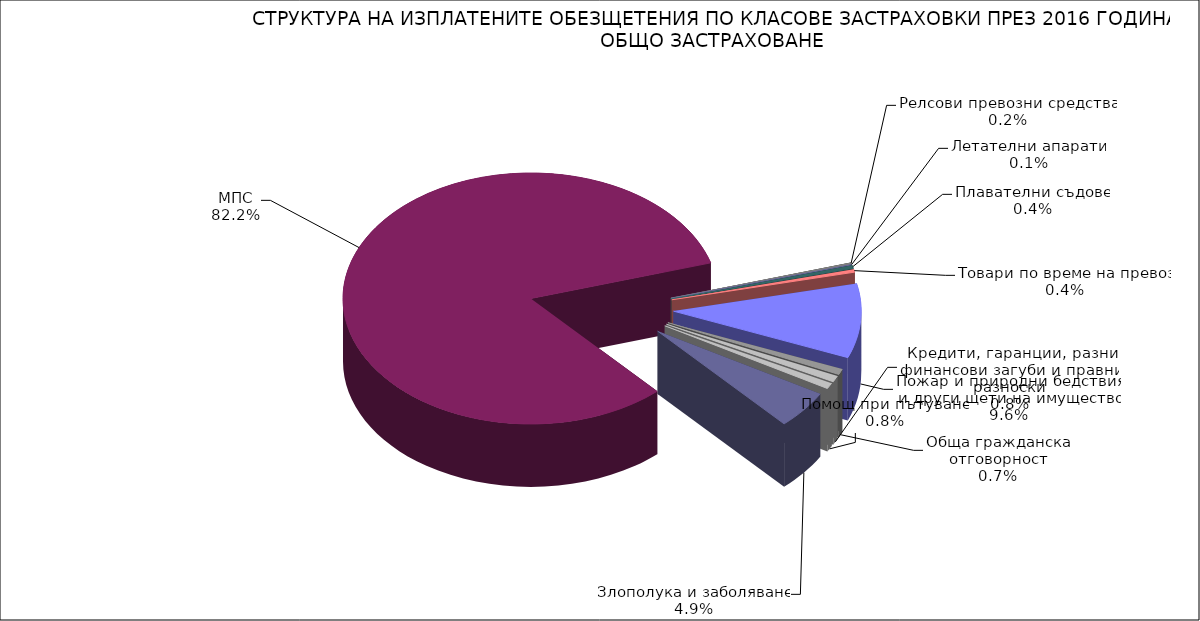
| Category | Series 0 |
|---|---|
| Злополука и заболяване | 0.049 |
| МПС | 0.822 |
| Релсови превозни средства | 0.002 |
| Летателни апарати | 0.001 |
| Плавателни съдове | 0.004 |
| Товари по време на превоз | 0.004 |
| Пожар и природни бедствия и други щети на имущество | 0.096 |
| Обща гражданска отговорност | 0.007 |
| Кредити, гаранции, разни финансови загуби и правни разноски | 0.008 |
| Помощ при пътуване | 0.008 |